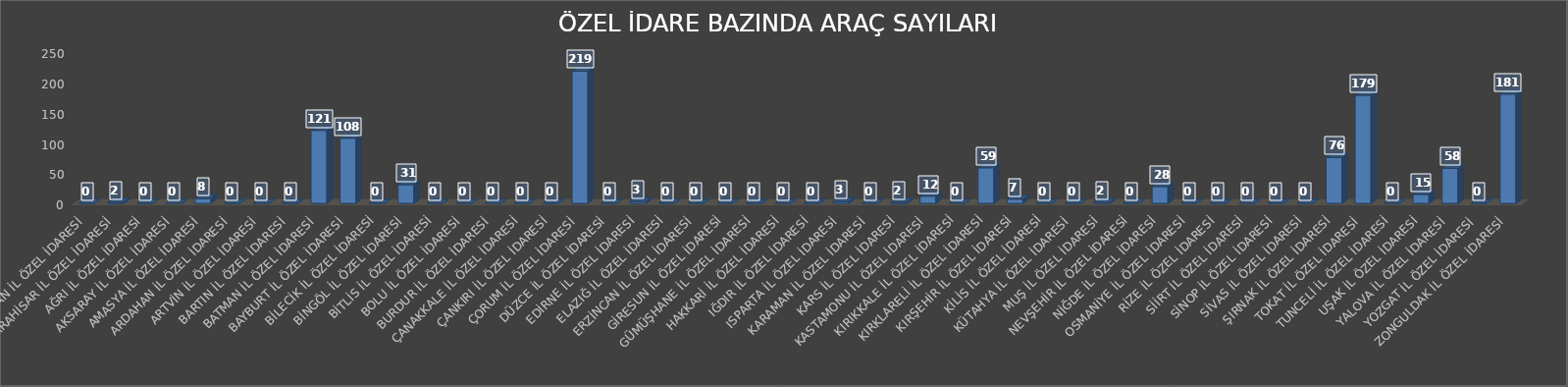
| Category | Series 0 |
|---|---|
| ADIYAMAN İL ÖZEL İDARESİ | 0 |
| AFYONKARAHİSAR İL ÖZEL İDARESİ | 2 |
| AĞRI İL ÖZEL İDARESİ | 0 |
| AKSARAY İL ÖZEL İDARESİ | 0 |
| AMASYA İL ÖZEL İDARESİ | 8 |
| ARDAHAN İL ÖZEL İDARESİ | 0 |
| ARTVİN İL ÖZEL İDARESİ | 0 |
| BARTIN İL ÖZEL İDARESİ | 0 |
| BATMAN İL ÖZEL İDARESİ | 121 |
| BAYBURT İL ÖZEL İDARESİ | 108 |
| BİLECİK İL ÖZEL İDARESİ | 0 |
| BİNGÖL İL ÖZEL İDARESİ | 31 |
| BİTLİS İL ÖZEL İDARESİ | 0 |
| BOLU İL ÖZEL İDARESİ | 0 |
| BURDUR İL ÖZEL İDARESİ | 0 |
| ÇANAKKALE İL ÖZEL İDARESİ | 0 |
| ÇANKIRI İL ÖZEL İDARESİ | 0 |
| ÇORUM İL ÖZEL İDARESİ | 219 |
| DÜZCE İL ÖZEL İDARESİ | 0 |
| EDİRNE İL ÖZEL İDARESİ | 3 |
| ELAZIĞ İL ÖZEL İDARESİ | 0 |
| ERZİNCAN İL ÖZEL İDARESİ | 0 |
| GİRESUN İL ÖZEL İDARESİ | 0 |
| GÜMÜŞHANE İL ÖZEL İDARESİ | 0 |
| HAKKARİ İL ÖZEL İDARESİ | 0 |
| IĞDIR İL ÖZEL İDARESİ | 0 |
| ISPARTA İL ÖZEL İDARESİ | 3 |
| KARAMAN İL ÖZEL İDARESİ | 0 |
| KARS İL ÖZEL İDARESİ | 2 |
| KASTAMONU İL ÖZEL İDARESİ | 12 |
| KIRIKKALE İL ÖZEL İDARESİ | 0 |
| KIRKLARELİ İL ÖZEL İDARESİ | 59 |
| KIRŞEHİR İL ÖZEL İDARESİ | 7 |
| KİLİS İL ÖZEL İDARESİ | 0 |
| KÜTAHYA İL ÖZEL İDARESİ | 0 |
| MUŞ İL ÖZEL İDARESİ | 2 |
| NEVŞEHİR İL ÖZEL İDARESİ | 0 |
| NİĞDE İL ÖZEL İDARESİ | 28 |
| OSMANİYE İL ÖZEL İDARESİ | 0 |
| RİZE İL ÖZEL İDARESİ | 0 |
| SİİRT İL ÖZEL İDARESİ | 0 |
| SİNOP İL ÖZEL İDARESİ | 0 |
| SİVAS İL ÖZEL İDARESİ | 0 |
| ŞIRNAK İL ÖZEL İDARESİ | 76 |
| TOKAT İL ÖZEL İDARESİ | 179 |
| TUNCELİ İL ÖZEL İDARESİ | 0 |
| UŞAK İL ÖZEL İDARESİ | 15 |
| YALOVA İL ÖZEL İDARESİ | 58 |
| YOZGAT İL ÖZEL İDARESİ | 0 |
| ZONGULDAK İL ÖZEL İDARESİ | 181 |